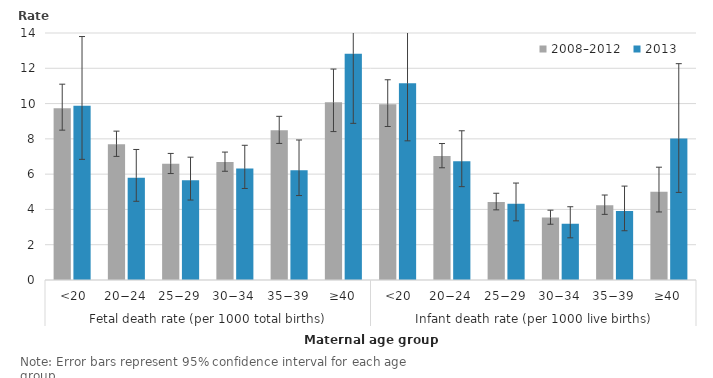
| Category | 2008–2012 | 2013 |
|---|---|---|
| 0 | 9.731 | 9.875 |
| 1 | 7.697 | 5.793 |
| 2 | 6.585 | 5.65 |
| 3 | 6.691 | 6.324 |
| 4 | 8.483 | 6.214 |
| 5 | 10.068 | 12.821 |
| 6 | 9.96 | 11.147 |
| 7 | 7.023 | 6.738 |
| 8 | 4.428 | 4.326 |
| 9 | 3.543 | 3.182 |
| 10 | 4.242 | 3.908 |
| 11 | 5.007 | 8.021 |